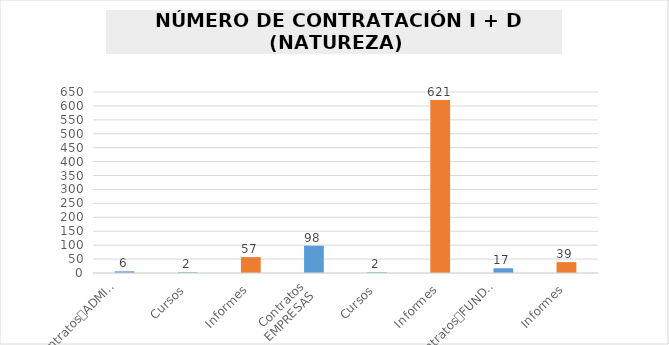
| Category | Series 0 |
|---|---|
| 0 | 6 |
| 1 | 2 |
| 2 | 57 |
| 3 | 98 |
| 4 | 2 |
| 5 | 621 |
| 6 | 17 |
| 7 | 39 |